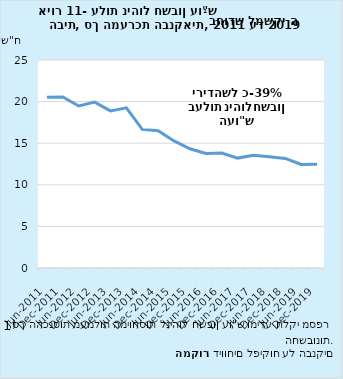
| Category | עלות לחשבון |
|---|---|
| 2011-06-30 | 20.535 |
| 2011-12-31 | 20.547 |
| 2012-06-30 | 19.476 |
| 2012-12-31 | 19.936 |
| 2013-06-30 | 18.885 |
| 2013-12-31 | 19.249 |
| 2014-06-30 | 16.658 |
| 2014-12-31 | 16.491 |
| 2015-06-30 | 15.269 |
| 2015-12-31 | 14.334 |
| 2016-06-30 | 13.765 |
| 2016-12-31 | 13.81 |
| 2017-06-30 | 13.21 |
| 2017-12-31 | 13.56 |
| 2018-06-30 | 13.384 |
| 2018-12-31 | 13.169 |
| 2019-06-30 | 12.444 |
| 2019-12-31 | 12.479 |